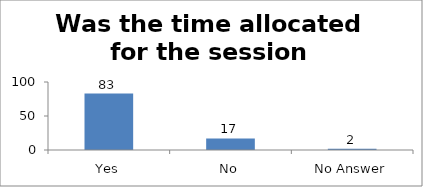
| Category | Was the time allocated for the session sufficient? |
|---|---|
| Yes | 83 |
| No | 17 |
| No Answer | 2 |